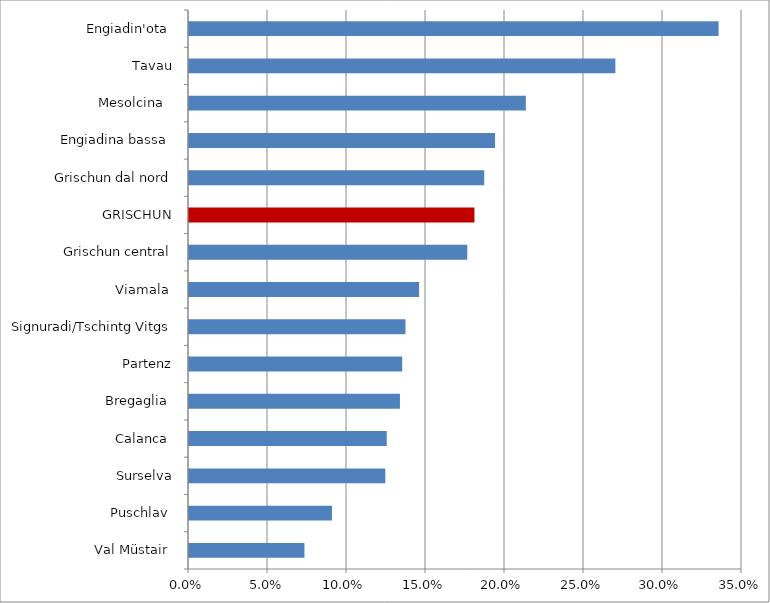
| Category | Series 0 |
|---|---|
| Val Müstair  | 0.073 |
| Poschiavo  | 0.09 |
| Surselva | 0.124 |
| Calanca  | 0.125 |
| Bregaglia  | 0.134 |
| Prättigau | 0.135 |
| Herrschaft/Fünf Dörfer | 0.137 |
| Viamala  | 0.146 |
| Mittelbünden | 0.176 |
| GRAUBÜNDEN | 0.181 |
| Nordbünden | 0.187 |
| Engiadina Bassa  | 0.194 |
| Mesolcina   | 0.213 |
| Davos | 0.27 |
| Oberengadin  | 0.335 |